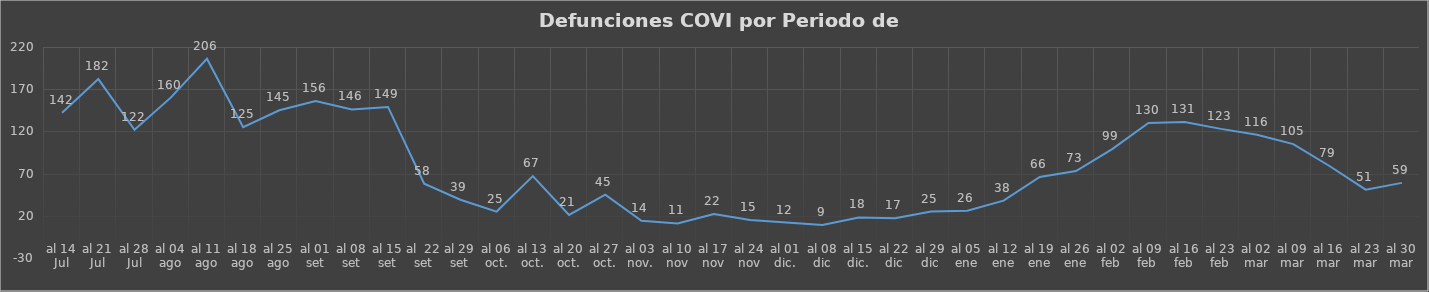
| Category | Series 0 |
|---|---|
| al 14 Jul | 142 |
| al 21 Jul | 182 |
| al 28 Jul | 122 |
| al 04 ago | 160 |
| al 11 ago | 206 |
| al 18 ago | 125 |
| al 25 ago | 145 |
| al 01 set | 156 |
| al 08 set | 146 |
| al 15 set | 149 |
| al  22 set | 58 |
| al 29 set | 39 |
| al 06 oct. | 25 |
| al 13 oct. | 67 |
| al 20 oct. | 21 |
| al 27 oct. | 45 |
| al 03 nov. | 14 |
| al 10 nov | 11 |
| al 17 nov | 22 |
| al 24 nov | 15 |
| al 01 dic. | 12 |
| al 08 dic | 9 |
| al 15 dic. | 18 |
| al 22 dic | 17 |
| al 29 dic | 25 |
| al 05 ene | 26 |
| al 12 ene | 38 |
| al 19 ene | 66 |
| al 26 ene | 73 |
| al 02 feb | 99 |
| al 09 feb | 130 |
| al 16 feb | 131 |
| al 23 feb | 123 |
| al 02 mar | 116 |
| al 09 mar | 105 |
| al 16 mar | 79 |
| al 23 mar | 51 |
| al 30 mar | 59 |